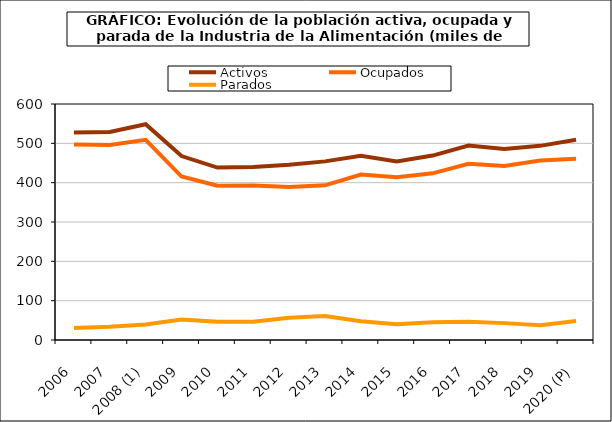
| Category | Activos | Ocupados | Parados |
|---|---|---|---|
| 2006 | 527.375 | 496.9 | 30.475 |
| 2007 | 529 | 495.6 | 33.4 |
| 2008 (1) | 548.65 | 509 | 39.7 |
| 2009 | 467.6 | 415.6 | 52 |
| 2010 | 438.425 | 392.275 | 46.2 |
| 2011 | 439.6 | 393.1 | 46.5 |
| 2012 | 445.725 | 388.925 | 56.8 |
| 2013 | 454.1 | 393.3 | 60.8 |
| 2014 | 468.5 | 420.7 | 47.8 |
| 2015 | 454.1 | 414 | 40.1 |
| 2016 | 468.925 | 423.675 | 45.25 |
| 2017 | 494.275 | 448.025 | 46.25 |
| 2018 | 485.3 | 442.4 | 42.9 |
| 2019 | 493.6 | 456.1 | 37.5 |
| 2020 (P) | 508.9 | 460.5 | 48.4 |